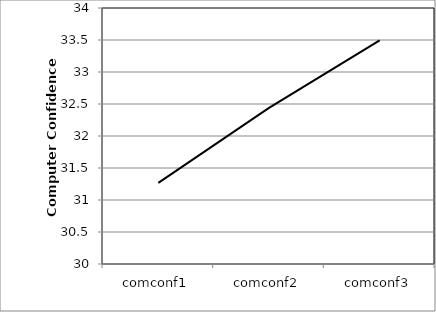
| Category | Series 0 |
|---|---|
| comconf1 | 31.267 |
| comconf2 | 32.44 |
| comconf3 | 33.493 |